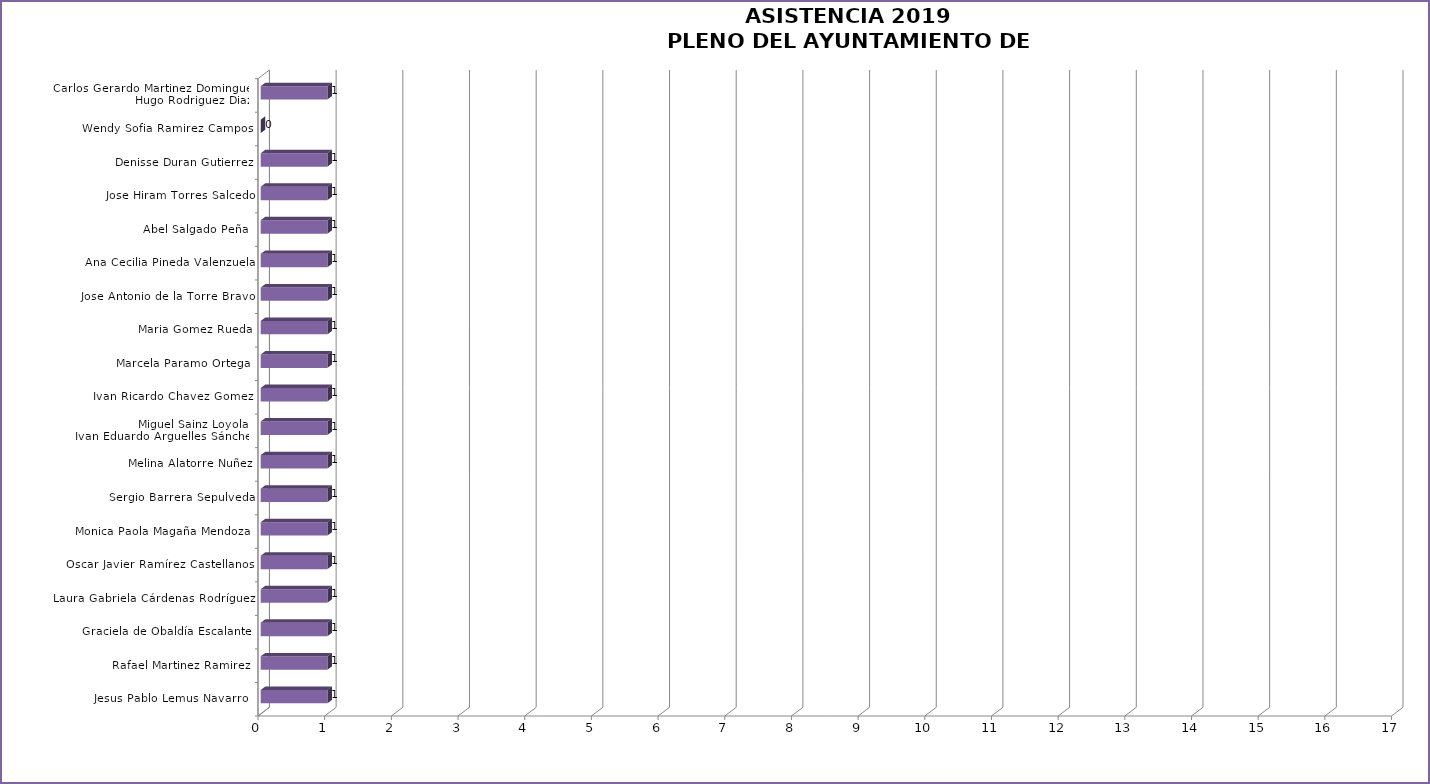
| Category | Series 0 |
|---|---|
| Jesus Pablo Lemus Navarro   | 1 |
| Rafael Martinez Ramirez  | 1 |
| Graciela de Obaldía Escalante  | 1 |
| Laura Gabriela Cárdenas Rodríguez  | 1 |
| Oscar Javier Ramírez Castellanos  | 1 |
| Monica Paola Magaña Mendoza  | 1 |
| Sergio Barrera Sepulveda | 1 |
| Melina Alatorre Nuñez | 1 |
| Miguel Sainz Loyola /
Ivan Eduardo Arguelles Sánchez  | 1 |
| Ivan Ricardo Chavez Gomez  | 1 |
| Marcela Paramo Ortega  | 1 |
| Maria Gomez Rueda | 1 |
| Jose Antonio de la Torre Bravo  | 1 |
| Ana Cecilia Pineda Valenzuela | 1 |
| Abel Salgado Peña  | 1 |
| Jose Hiram Torres Salcedo | 1 |
| Denisse Duran Gutierrez | 1 |
| Wendy Sofia Ramirez Campos  | 0 |
| Carlos Gerardo Martinez Dominguez/
Hugo Rodriguez Diaz  | 1 |